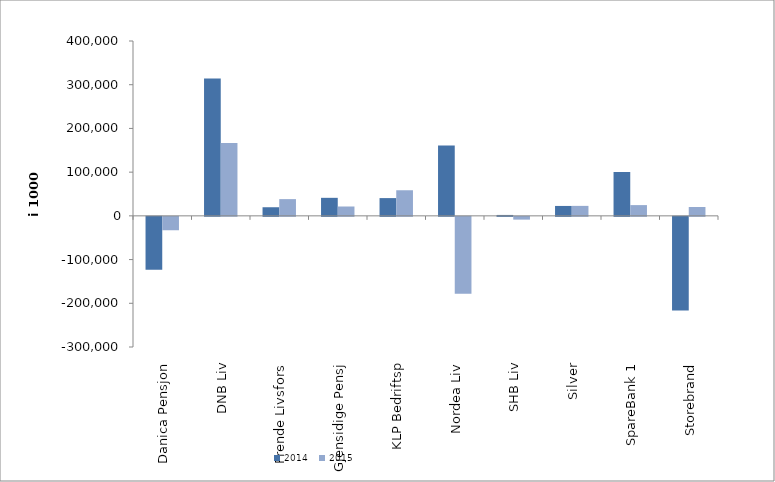
| Category | 2014 | 2015 |
|---|---|---|
| Danica Pensjon | -121184.308 | -30643.935 |
| DNB Liv | 314351 | 166420 |
| Frende Livsfors | 19709.887 | 38291 |
| Gjensidige Pensj | 41241.316 | 21403.637 |
| KLP Bedriftsp | 40633 | 58569 |
| Nordea Liv | 161076.759 | -176070.556 |
| SHB Liv | 2089 | -6326 |
| Silver | 22673.792 | 22825.487 |
| SpareBank 1 | 100374.947 | 24611.235 |
| Storebrand | -214290.447 | 20268.996 |